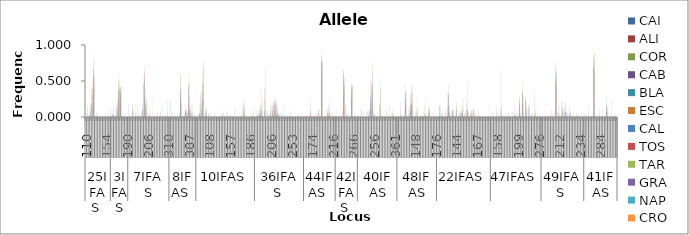
| Category | CAI | ALI | COR | CAB | BLA | ESC  | CAL | TOS | TAR | GRA | NAP  | CRO |
|---|---|---|---|---|---|---|---|---|---|---|---|---|
| 0 | 0 | 0 | 0 | 0 | 0 | 0 | 0.042 | 0 | 0 | 0 | 0 | 0 |
| 1 | 0 | 0 | 0 | 0 | 0 | 0 | 0.167 | 0 | 0 | 0.056 | 0.125 | 0 |
| 2 | 0 | 0 | 0 | 0 | 0 | 0.031 | 0 | 0 | 0 | 0 | 0.025 | 0.05 |
| 3 | 0.071 | 0.15 | 0 | 0 | 0.188 | 0.094 | 0.042 | 0.029 | 0.033 | 0 | 0 | 0 |
| 4 | 0.393 | 0.15 | 0.333 | 0.194 | 0.188 | 0.469 | 0.125 | 0.412 | 0.1 | 0.306 | 0.3 | 0.4 |
| 5 | 0.464 | 0.65 | 0.667 | 0.778 | 0.562 | 0.344 | 0.583 | 0.559 | 0.867 | 0.611 | 0.4 | 0.525 |
| 6 | 0 | 0 | 0 | 0 | 0 | 0 | 0 | 0 | 0 | 0.028 | 0.025 | 0 |
| 7 | 0.036 | 0 | 0 | 0 | 0.062 | 0 | 0 | 0 | 0 | 0 | 0.075 | 0 |
| 8 | 0 | 0 | 0 | 0 | 0 | 0 | 0.042 | 0 | 0 | 0 | 0 | 0 |
| 9 | 0 | 0 | 0 | 0.028 | 0 | 0 | 0 | 0 | 0 | 0 | 0 | 0 |
| 10 | 0 | 0 | 0 | 0 | 0 | 0.031 | 0 | 0 | 0 | 0 | 0 | 0 |
| 11 | 0.036 | 0 | 0 | 0 | 0 | 0 | 0 | 0 | 0 | 0 | 0 | 0 |
| 12 | 0 | 0 | 0 | 0 | 0 | 0.031 | 0 | 0 | 0 | 0 | 0.025 | 0 |
| 13 | 0 | 0 | 0 | 0 | 0 | 0 | 0 | 0 | 0 | 0 | 0.025 | 0 |
| 14 | 0 | 0.05 | 0 | 0 | 0 | 0 | 0 | 0 | 0 | 0 | 0 | 0 |
| 15 | 0 | 0 | 0 | 0 | 0 | 0 | 0 | 0 | 0 | 0 | 0 | 0.025 |
| 16 | 0 | 0 | 0 | 0.111 | 0.021 | 0.062 | 0 | 0 | 0 | 0 | 0 | 0 |
| 17 | 0.036 | 0.05 | 0 | 0 | 0.021 | 0.031 | 0 | 0.029 | 0.029 | 0.2 | 0.1 | 0.05 |
| 18 | 0 | 0 | 0 | 0.028 | 0.042 | 0 | 0 | 0 | 0 | 0 | 0 | 0 |
| 19 | 0 | 0 | 0 | 0 | 0 | 0 | 0.083 | 0 | 0 | 0 | 0 | 0 |
| 20 | 0.179 | 0.15 | 0 | 0.083 | 0.229 | 0.094 | 0.125 | 0.147 | 0.176 | 0.05 | 0.25 | 0.175 |
| 21 | 0.393 | 0.5 | 0.583 | 0.361 | 0.333 | 0.469 | 0.375 | 0.412 | 0.382 | 0.525 | 0.2 | 0.325 |
| 22 | 0.357 | 0.3 | 0.417 | 0.333 | 0.354 | 0.344 | 0.417 | 0.412 | 0.353 | 0.225 | 0.45 | 0.425 |
| 23 | 0 | 0 | 0 | 0.028 | 0 | 0 | 0 | 0 | 0 | 0 | 0 | 0.025 |
| 24 | 0.036 | 0 | 0 | 0 | 0 | 0 | 0 | 0 | 0 | 0 | 0 | 0 |
| 25 | 0 | 0 | 0 | 0.056 | 0 | 0 | 0 | 0 | 0 | 0 | 0 | 0 |
| 26 | 0 | 0 | 0 | 0 | 0 | 0 | 0 | 0 | 0.059 | 0 | 0 | 0 |
| 27 | 0 | 0 | 0 | 0.176 | 0 | 0 | 0 | 0 | 0 | 0 | 0 | 0 |
| 28 | 0 | 0 | 0 | 0 | 0.021 | 0 | 0 | 0 | 0 | 0 | 0 | 0 |
| 29 | 0 | 0 | 0 | 0 | 0 | 0 | 0 | 0 | 0.062 | 0.062 | 0 | 0 |
| 30 | 0.107 | 0.167 | 0.167 | 0 | 0.042 | 0 | 0.083 | 0 | 0 | 0 | 0 | 0.105 |
| 31 | 0 | 0 | 0 | 0 | 0 | 0 | 0 | 0 | 0.188 | 0.062 | 0.028 | 0 |
| 32 | 0 | 0 | 0 | 0 | 0 | 0 | 0 | 0 | 0 | 0.062 | 0 | 0 |
| 33 | 0 | 0.167 | 0 | 0 | 0 | 0 | 0 | 0 | 0.094 | 0 | 0.028 | 0.026 |
| 34 | 0 | 0 | 0 | 0 | 0 | 0 | 0.042 | 0 | 0 | 0 | 0 | 0 |
| 35 | 0 | 0 | 0 | 0 | 0 | 0 | 0.083 | 0 | 0 | 0 | 0 | 0.026 |
| 36 | 0.179 | 0.056 | 0 | 0.088 | 0 | 0.125 | 0.125 | 0.088 | 0.031 | 0 | 0.028 | 0.026 |
| 37 | 0.464 | 0.444 | 0.583 | 0.5 | 0.542 | 0.625 | 0.292 | 0.706 | 0.281 | 0.625 | 0.278 | 0.184 |
| 38 | 0.143 | 0.167 | 0 | 0.176 | 0.375 | 0.125 | 0.25 | 0.147 | 0.219 | 0 | 0.194 | 0.263 |
| 39 | 0 | 0 | 0 | 0 | 0 | 0 | 0.083 | 0 | 0 | 0 | 0 | 0 |
| 40 | 0 | 0 | 0 | 0.029 | 0 | 0.125 | 0 | 0.029 | 0 | 0 | 0.028 | 0.053 |
| 41 | 0 | 0 | 0 | 0 | 0 | 0 | 0.042 | 0 | 0 | 0 | 0 | 0 |
| 42 | 0 | 0 | 0 | 0 | 0 | 0 | 0 | 0 | 0 | 0 | 0.056 | 0.263 |
| 43 | 0 | 0 | 0 | 0 | 0 | 0 | 0 | 0 | 0 | 0 | 0.056 | 0.026 |
| 44 | 0 | 0 | 0 | 0 | 0 | 0 | 0 | 0 | 0 | 0 | 0 | 0.026 |
| 45 | 0 | 0 | 0 | 0 | 0 | 0 | 0 | 0 | 0 | 0.062 | 0.056 | 0 |
| 46 | 0 | 0 | 0 | 0 | 0 | 0 | 0 | 0 | 0 | 0.062 | 0 | 0 |
| 47 | 0 | 0 | 0 | 0 | 0 | 0 | 0 | 0 | 0.125 | 0.062 | 0.056 | 0 |
| 48 | 0 | 0 | 0 | 0 | 0 | 0 | 0 | 0 | 0 | 0 | 0.167 | 0 |
| 49 | 0 | 0 | 0 | 0 | 0 | 0 | 0 | 0 | 0 | 0 | 0.028 | 0 |
| 50 | 0 | 0 | 0 | 0 | 0 | 0 | 0 | 0.029 | 0 | 0 | 0 | 0 |
| 51 | 0.036 | 0 | 0 | 0 | 0.021 | 0 | 0 | 0 | 0 | 0 | 0 | 0 |
| 52 | 0.071 | 0 | 0.25 | 0.029 | 0 | 0 | 0 | 0 | 0 | 0 | 0 | 0 |
| 53 | 0 | 0 | 0 | 0 | 0 | 0 | 0 | 0 | 0.25 | 0.231 | 0 | 0 |
| 54 | 0 | 0 | 0 | 0 | 0 | 0 | 0 | 0 | 0 | 0.077 | 0 | 0 |
| 55 | 0.036 | 0 | 0 | 0 | 0 | 0 | 0 | 0 | 0 | 0 | 0 | 0 |
| 56 | 0 | 0 | 0 | 0.028 | 0 | 0.042 | 0 | 0 | 0 | 0 | 0 | 0 |
| 57 | 0 | 0 | 0 | 0 | 0.022 | 0 | 0 | 0 | 0 | 0 | 0 | 0 |
| 58 | 0 | 0 | 0 | 0.028 | 0 | 0 | 0 | 0 | 0 | 0 | 0 | 0 |
| 59 | 0 | 0 | 0 | 0 | 0 | 0 | 0.042 | 0 | 0.062 | 0 | 0 | 0 |
| 60 | 0.357 | 0.6 | 0.583 | 0.417 | 0.37 | 0.375 | 0.292 | 0.233 | 0.406 | 0.192 | 0.222 | 0 |
| 61 | 0 | 0 | 0 | 0.028 | 0 | 0 | 0 | 0 | 0 | 0.038 | 0 | 0 |
| 62 | 0 | 0 | 0 | 0 | 0 | 0 | 0 | 0 | 0.062 | 0 | 0 | 0 |
| 63 | 0.036 | 0.1 | 0.083 | 0.056 | 0.13 | 0.083 | 0.167 | 0 | 0.062 | 0.077 | 0.056 | 0.111 |
| 64 | 0.107 | 0 | 0.083 | 0.056 | 0 | 0 | 0.042 | 0.067 | 0 | 0.077 | 0 | 0.056 |
| 65 | 0.357 | 0.15 | 0 | 0.194 | 0.413 | 0.417 | 0.458 | 0.467 | 0.125 | 0.308 | 0.472 | 0.611 |
| 66 | 0.107 | 0.1 | 0.083 | 0.111 | 0.065 | 0.042 | 0 | 0.133 | 0.031 | 0 | 0.083 | 0.194 |
| 67 | 0 | 0.05 | 0.167 | 0.028 | 0 | 0.042 | 0 | 0.067 | 0 | 0 | 0.167 | 0.028 |
| 68 | 0 | 0 | 0 | 0 | 0 | 0 | 0 | 0.033 | 0 | 0 | 0 | 0 |
| 69 | 0 | 0 | 0 | 0.056 | 0 | 0 | 0 | 0 | 0 | 0 | 0 | 0 |
| 70 | 0.036 | 0 | 0 | 0 | 0 | 0 | 0 | 0 | 0 | 0 | 0 | 0 |
| 71 | 0 | 0 | 0 | 0 | 0 | 0 | 0.042 | 0 | 0 | 0.026 | 0.025 | 0 |
| 72 | 0.036 | 0.05 | 0.167 | 0.062 | 0.021 | 0.038 | 0 | 0 | 0 | 0 | 0.025 | 0 |
| 73 | 0.179 | 0.3 | 0.333 | 0.094 | 0.438 | 0.115 | 0.208 | 0 | 0 | 0.053 | 0.05 | 0 |
| 74 | 0.5 | 0.35 | 0.417 | 0.25 | 0.208 | 0.654 | 0.25 | 0.471 | 0.765 | 0.684 | 0.775 | 0.5 |
| 75 | 0 | 0 | 0 | 0 | 0 | 0 | 0 | 0 | 0 | 0.026 | 0.025 | 0 |
| 76 | 0.143 | 0.05 | 0 | 0.062 | 0.104 | 0 | 0.083 | 0.029 | 0.147 | 0.105 | 0 | 0.105 |
| 77 | 0 | 0 | 0 | 0 | 0 | 0 | 0 | 0 | 0 | 0.053 | 0 | 0 |
| 78 | 0 | 0.05 | 0 | 0 | 0 | 0 | 0.042 | 0 | 0 | 0 | 0 | 0.026 |
| 79 | 0 | 0 | 0 | 0 | 0 | 0 | 0.042 | 0 | 0 | 0 | 0 | 0 |
| 80 | 0 | 0 | 0 | 0 | 0 | 0 | 0 | 0 | 0 | 0 | 0.025 | 0 |
| 81 | 0 | 0 | 0 | 0 | 0 | 0 | 0 | 0 | 0 | 0.053 | 0 | 0 |
| 82 | 0 | 0 | 0 | 0 | 0 | 0 | 0 | 0.029 | 0 | 0 | 0 | 0 |
| 83 | 0 | 0 | 0 | 0 | 0 | 0 | 0 | 0 | 0 | 0 | 0.025 | 0 |
| 84 | 0 | 0 | 0 | 0 | 0 | 0 | 0 | 0 | 0 | 0 | 0 | 0.026 |
| 85 | 0 | 0 | 0 | 0 | 0.042 | 0 | 0 | 0 | 0 | 0 | 0 | 0 |
| 86 | 0 | 0.05 | 0 | 0 | 0 | 0 | 0 | 0.059 | 0 | 0 | 0 | 0 |
| 87 | 0 | 0 | 0.083 | 0.031 | 0 | 0 | 0 | 0 | 0 | 0 | 0 | 0 |
| 88 | 0 | 0 | 0 | 0 | 0 | 0 | 0 | 0 | 0 | 0 | 0.025 | 0 |
| 89 | 0 | 0 | 0 | 0 | 0.021 | 0.077 | 0 | 0.029 | 0 | 0 | 0 | 0.079 |
| 90 | 0 | 0 | 0 | 0 | 0.021 | 0 | 0 | 0 | 0 | 0 | 0 | 0 |
| 91 | 0 | 0 | 0 | 0 | 0.021 | 0 | 0.042 | 0 | 0 | 0 | 0 | 0 |
| 92 | 0 | 0 | 0 | 0 | 0 | 0 | 0 | 0.029 | 0 | 0 | 0 | 0 |
| 93 | 0 | 0 | 0 | 0 | 0.021 | 0 | 0 | 0 | 0 | 0 | 0 | 0.026 |
| 94 | 0 | 0 | 0 | 0.125 | 0 | 0 | 0 | 0 | 0 | 0 | 0 | 0 |
| 95 | 0 | 0 | 0 | 0 | 0.021 | 0 | 0 | 0 | 0 | 0 | 0 | 0 |
| 96 | 0 | 0 | 0 | 0 | 0 | 0 | 0 | 0.029 | 0 | 0 | 0 | 0 |
| 97 | 0 | 0 | 0 | 0 | 0 | 0 | 0 | 0 | 0 | 0 | 0 | 0.053 |
| 98 | 0 | 0 | 0 | 0 | 0 | 0 | 0 | 0.029 | 0 | 0 | 0 | 0 |
| 99 | 0 | 0 | 0 | 0.125 | 0 | 0 | 0.042 | 0 | 0 | 0 | 0 | 0 |
| 100 | 0.036 | 0.15 | 0 | 0.25 | 0.083 | 0.115 | 0.125 | 0.206 | 0.029 | 0 | 0.025 | 0.105 |
| 101 | 0 | 0 | 0 | 0 | 0 | 0 | 0 | 0 | 0 | 0 | 0 | 0.026 |
| 102 | 0.036 | 0 | 0 | 0 | 0 | 0 | 0 | 0 | 0 | 0 | 0 | 0 |
| 103 | 0 | 0 | 0 | 0 | 0 | 0 | 0 | 0 | 0.029 | 0 | 0 | 0 |
| 104 | 0 | 0 | 0 | 0 | 0 | 0 | 0 | 0.029 | 0.029 | 0 | 0 | 0.053 |
| 105 | 0.036 | 0 | 0 | 0 | 0 | 0 | 0 | 0 | 0 | 0 | 0 | 0 |
| 106 | 0 | 0 | 0 | 0 | 0 | 0 | 0.125 | 0.059 | 0 | 0 | 0 | 0 |
| 107 | 0 | 0 | 0 | 0 | 0 | 0 | 0 | 0 | 0.029 | 0 | 0 | 0 |
| 108 | 0 | 0 | 0 | 0 | 0 | 0 | 0 | 0.094 | 0 | 0 | 0.025 | 0.079 |
| 109 | 0.036 | 0 | 0 | 0 | 0.021 | 0.033 | 0 | 0.031 | 0 | 0 | 0.025 | 0.079 |
| 110 | 0.036 | 0.15 | 0 | 0.056 | 0.042 | 0.067 | 0.042 | 0 | 0.029 | 0.025 | 0.175 | 0.132 |
| 111 | 0.107 | 0.4 | 0 | 0 | 0.083 | 0 | 0.042 | 0.094 | 0.088 | 0.2 | 0.2 | 0.132 |
| 112 | 0 | 0 | 0.083 | 0 | 0.021 | 0 | 0 | 0 | 0 | 0 | 0 | 0.026 |
| 113 | 0.107 | 0 | 0 | 0.389 | 0.062 | 0.233 | 0.083 | 0.031 | 0.412 | 0.675 | 0.2 | 0 |
| 114 | 0 | 0 | 0 | 0 | 0.021 | 0 | 0.083 | 0 | 0 | 0 | 0.05 | 0.053 |
| 115 | 0 | 0.1 | 0 | 0 | 0.021 | 0 | 0 | 0 | 0 | 0 | 0.05 | 0 |
| 116 | 0 | 0 | 0 | 0 | 0 | 0.033 | 0 | 0.031 | 0.029 | 0.05 | 0 | 0 |
| 117 | 0.036 | 0.2 | 0 | 0.083 | 0.104 | 0.033 | 0 | 0.156 | 0 | 0 | 0 | 0.026 |
| 118 | 0 | 0 | 0.083 | 0 | 0.083 | 0.1 | 0.167 | 0.219 | 0 | 0 | 0.025 | 0.026 |
| 119 | 0.179 | 0.05 | 0.167 | 0.111 | 0.188 | 0.233 | 0.292 | 0.219 | 0.059 | 0 | 0.025 | 0.132 |
| 120 | 0.214 | 0 | 0.25 | 0.194 | 0.167 | 0.2 | 0.042 | 0.062 | 0.088 | 0.025 | 0 | 0.105 |
| 121 | 0.179 | 0.05 | 0.25 | 0.139 | 0.062 | 0 | 0.042 | 0.031 | 0.176 | 0.025 | 0.05 | 0.026 |
| 122 | 0.036 | 0 | 0 | 0.028 | 0.062 | 0 | 0.042 | 0 | 0 | 0 | 0.05 | 0.026 |
| 123 | 0 | 0 | 0 | 0 | 0.062 | 0 | 0 | 0 | 0 | 0 | 0.025 | 0.053 |
| 124 | 0 | 0 | 0 | 0 | 0 | 0 | 0.042 | 0 | 0 | 0 | 0 | 0 |
| 125 | 0 | 0 | 0.167 | 0 | 0 | 0 | 0 | 0 | 0 | 0 | 0.05 | 0.026 |
| 126 | 0.036 | 0 | 0 | 0 | 0 | 0 | 0 | 0 | 0 | 0 | 0 | 0 |
| 127 | 0 | 0 | 0 | 0 | 0 | 0 | 0.042 | 0 | 0.029 | 0 | 0 | 0 |
| 128 | 0 | 0 | 0 | 0 | 0 | 0 | 0 | 0 | 0.059 | 0 | 0 | 0 |
| 129 | 0 | 0 | 0 | 0 | 0 | 0 | 0.083 | 0 | 0 | 0 | 0.025 | 0 |
| 130 | 0.036 | 0 | 0 | 0 | 0 | 0 | 0 | 0 | 0 | 0 | 0 | 0 |
| 131 | 0 | 0 | 0 | 0 | 0 | 0 | 0 | 0 | 0 | 0 | 0 | 0.026 |
| 132 | 0 | 0 | 0 | 0 | 0 | 0 | 0 | 0 | 0 | 0 | 0 | 0.026 |
| 133 | 0 | 0 | 0 | 0 | 0 | 0 | 0 | 0 | 0 | 0 | 0 | 0.026 |
| 134 | 0 | 0 | 0 | 0 | 0 | 0.033 | 0 | 0 | 0 | 0 | 0.025 | 0 |
| 135 | 0 | 0 | 0 | 0 | 0 | 0 | 0 | 0.031 | 0 | 0 | 0 | 0 |
| 136 | 0 | 0 | 0 | 0 | 0 | 0.033 | 0 | 0 | 0 | 0 | 0 | 0 |
| 137 | 0 | 0.05 | 0 | 0 | 0 | 0 | 0 | 0 | 0 | 0 | 0 | 0 |
| 138 | 0 | 0 | 0 | 0 | 0 | 0 | 0 | 0.029 | 0 | 0 | 0 | 0 |
| 139 | 0 | 0 | 0 | 0 | 0 | 0 | 0 | 0 | 0 | 0 | 0 | 0.026 |
| 140 | 0 | 0 | 0 | 0 | 0 | 0 | 0 | 0 | 0 | 0 | 0.025 | 0 |
| 141 | 0 | 0 | 0 | 0 | 0 | 0 | 0 | 0 | 0 | 0 | 0.025 | 0 |
| 142 | 0.071 | 0.05 | 0.25 | 0.111 | 0 | 0.031 | 0 | 0 | 0 | 0 | 0.075 | 0 |
| 143 | 0 | 0 | 0 | 0 | 0 | 0 | 0 | 0 | 0.029 | 0 | 0 | 0 |
| 144 | 0 | 0 | 0 | 0 | 0 | 0 | 0 | 0.029 | 0 | 0 | 0 | 0 |
| 145 | 0 | 0 | 0 | 0 | 0 | 0 | 0 | 0.059 | 0 | 0 | 0 | 0 |
| 146 | 0 | 0 | 0 | 0 | 0 | 0 | 0 | 0 | 0 | 0.059 | 0.075 | 0.026 |
| 147 | 0 | 0.05 | 0 | 0 | 0 | 0 | 0 | 0 | 0.088 | 0.118 | 0 | 0 |
| 148 | 0 | 0.1 | 0 | 0 | 0 | 0 | 0 | 0 | 0.029 | 0 | 0 | 0 |
| 149 | 0.786 | 0.65 | 0.5 | 0.722 | 0.917 | 0.812 | 0.75 | 0.853 | 0.735 | 0.765 | 0.775 | 0.789 |
| 150 | 0 | 0 | 0 | 0 | 0 | 0 | 0 | 0 | 0 | 0 | 0 | 0.026 |
| 151 | 0 | 0 | 0 | 0 | 0 | 0 | 0 | 0 | 0 | 0 | 0 | 0.026 |
| 152 | 0 | 0 | 0 | 0 | 0 | 0 | 0 | 0 | 0 | 0 | 0 | 0.026 |
| 153 | 0.107 | 0.05 | 0 | 0.083 | 0.042 | 0 | 0.167 | 0.029 | 0.029 | 0 | 0.025 | 0.079 |
| 154 | 0.036 | 0.05 | 0.25 | 0.056 | 0.042 | 0.156 | 0.083 | 0 | 0 | 0 | 0 | 0 |
| 155 | 0 | 0 | 0 | 0 | 0 | 0 | 0 | 0 | 0 | 0.059 | 0 | 0 |
| 156 | 0 | 0.05 | 0 | 0 | 0 | 0 | 0 | 0 | 0.088 | 0 | 0 | 0 |
| 157 | 0 | 0 | 0 | 0.028 | 0 | 0 | 0 | 0 | 0 | 0 | 0 | 0 |
| 158 | 0.036 | 0 | 0 | 0 | 0 | 0 | 0.091 | 0 | 0 | 0 | 0 | 0 |
| 159 | 0 | 0 | 0 | 0 | 0 | 0 | 0 | 0.029 | 0 | 0 | 0 | 0.028 |
| 160 | 0 | 0 | 0 | 0 | 0 | 0 | 0 | 0 | 0 | 0 | 0 | 0.028 |
| 161 | 0 | 0 | 0 | 0 | 0 | 0 | 0 | 0.059 | 0 | 0 | 0 | 0 |
| 162 | 0 | 0 | 0 | 0 | 0.021 | 0 | 0 | 0 | 0.062 | 0.118 | 0 | 0 |
| 163 | 0.5 | 0.6 | 0.667 | 0.324 | 0.646 | 0.4 | 0.591 | 0.529 | 0.469 | 0.441 | 0.55 | 0.389 |
| 164 | 0 | 0 | 0 | 0.176 | 0 | 0.133 | 0.045 | 0 | 0.031 | 0 | 0 | 0.028 |
| 165 | 0 | 0 | 0 | 0 | 0.042 | 0 | 0 | 0 | 0 | 0 | 0 | 0.056 |
| 166 | 0 | 0 | 0 | 0.059 | 0 | 0 | 0 | 0 | 0 | 0 | 0 | 0 |
| 167 | 0 | 0 | 0 | 0 | 0.021 | 0 | 0 | 0 | 0 | 0 | 0 | 0 |
| 168 | 0.464 | 0.4 | 0.333 | 0.441 | 0.229 | 0.433 | 0.273 | 0.382 | 0.438 | 0.441 | 0.45 | 0.417 |
| 169 | 0 | 0 | 0 | 0 | 0.021 | 0 | 0 | 0 | 0 | 0 | 0 | 0 |
| 170 | 0 | 0 | 0 | 0 | 0.021 | 0.033 | 0 | 0 | 0 | 0 | 0 | 0 |
| 171 | 0 | 0 | 0 | 0 | 0 | 0 | 0 | 0 | 0 | 0 | 0 | 0.056 |
| 172 | 0 | 0 | 0 | 0 | 0 | 0 | 0.042 | 0 | 0 | 0 | 0 | 0 |
| 173 | 0 | 0 | 0 | 0 | 0 | 0 | 0 | 0 | 0 | 0 | 0.143 | 0 |
| 174 | 0 | 0 | 0 | 0 | 0 | 0 | 0.083 | 0 | 0 | 0.091 | 0 | 0 |
| 175 | 0 | 0 | 0 | 0 | 0 | 0 | 0 | 0 | 0 | 0.091 | 0 | 0 |
| 176 | 0 | 0 | 0 | 0 | 0 | 0 | 0.042 | 0 | 0 | 0 | 0 | 0 |
| 177 | 0 | 0 | 0 | 0 | 0 | 0 | 0 | 0 | 0 | 0.091 | 0.071 | 0 |
| 178 | 0 | 0 | 0 | 0 | 0 | 0 | 0 | 0 | 0.071 | 0.091 | 0.071 | 0 |
| 179 | 0.036 | 0 | 0 | 0 | 0 | 0 | 0.125 | 0 | 0 | 0.091 | 0.071 | 0.033 |
| 180 | 0.321 | 0.2 | 0.5 | 0.286 | 0.104 | 0.107 | 0.25 | 0 | 0.321 | 0.227 | 0.179 | 0.067 |
| 181 | 0.464 | 0.45 | 0.5 | 0.643 | 0.417 | 0.75 | 0.208 | 0.469 | 0.071 | 0.136 | 0.393 | 0.367 |
| 182 | 0 | 0 | 0 | 0 | 0.062 | 0 | 0 | 0.031 | 0.179 | 0.045 | 0.036 | 0.033 |
| 183 | 0 | 0 | 0 | 0.036 | 0 | 0 | 0 | 0 | 0 | 0 | 0 | 0 |
| 184 | 0 | 0 | 0 | 0 | 0 | 0 | 0 | 0 | 0 | 0 | 0 | 0.067 |
| 185 | 0 | 0 | 0 | 0 | 0 | 0 | 0 | 0 | 0.036 | 0 | 0 | 0 |
| 186 | 0.179 | 0.15 | 0 | 0 | 0.375 | 0.107 | 0.042 | 0.469 | 0.25 | 0.045 | 0 | 0.4 |
| 187 | 0 | 0 | 0 | 0 | 0 | 0 | 0 | 0 | 0.036 | 0 | 0 | 0 |
| 188 | 0 | 0 | 0 | 0 | 0 | 0 | 0 | 0 | 0 | 0 | 0 | 0.033 |
| 189 | 0 | 0 | 0 | 0 | 0 | 0 | 0 | 0 | 0 | 0.045 | 0 | 0 |
| 190 | 0 | 0.1 | 0 | 0 | 0 | 0 | 0 | 0 | 0 | 0 | 0 | 0 |
| 191 | 0 | 0 | 0 | 0 | 0 | 0.036 | 0 | 0 | 0 | 0 | 0 | 0 |
| 192 | 0 | 0 | 0 | 0 | 0 | 0 | 0.167 | 0 | 0 | 0 | 0 | 0 |
| 193 | 0 | 0 | 0 | 0 | 0 | 0 | 0 | 0.031 | 0 | 0.045 | 0 | 0 |
| 194 | 0 | 0.1 | 0 | 0.036 | 0 | 0 | 0.042 | 0 | 0.036 | 0 | 0.036 | 0 |
| 195 | 0 | 0 | 0 | 0 | 0.021 | 0 | 0 | 0 | 0 | 0 | 0 | 0 |
| 196 | 0 | 0 | 0 | 0 | 0.021 | 0 | 0 | 0 | 0 | 0 | 0 | 0 |
| 197 | 0 | 0 | 0 | 0 | 0 | 0 | 0 | 0 | 0 | 0 | 0 | 0.025 |
| 198 | 0 | 0 | 0 | 0 | 0 | 0 | 0 | 0 | 0 | 0 | 0 | 0.025 |
| 199 | 0 | 0.111 | 0 | 0 | 0.021 | 0 | 0.208 | 0.029 | 0 | 0 | 0 | 0 |
| 200 | 0 | 0 | 0 | 0 | 0 | 0 | 0.042 | 0 | 0 | 0 | 0 | 0 |
| 201 | 0 | 0 | 0 | 0 | 0.021 | 0 | 0.042 | 0 | 0 | 0 | 0 | 0 |
| 202 | 0.464 | 0.167 | 0.25 | 0.333 | 0.375 | 0.219 | 0.125 | 0.324 | 0.219 | 0.325 | 0.263 | 0.175 |
| 203 | 0 | 0 | 0 | 0 | 0 | 0 | 0 | 0 | 0 | 0 | 0 | 0.025 |
| 204 | 0 | 0 | 0 | 0 | 0 | 0.031 | 0.125 | 0 | 0 | 0 | 0 | 0 |
| 205 | 0.143 | 0.056 | 0.083 | 0.167 | 0.188 | 0.312 | 0.083 | 0.118 | 0.312 | 0.175 | 0.132 | 0.35 |
| 206 | 0.179 | 0.444 | 0.167 | 0.222 | 0.312 | 0.188 | 0.125 | 0.176 | 0.094 | 0.325 | 0.447 | 0.35 |
| 207 | 0 | 0 | 0 | 0 | 0 | 0 | 0 | 0 | 0.031 | 0.025 | 0 | 0 |
| 208 | 0 | 0 | 0 | 0 | 0 | 0.094 | 0.042 | 0 | 0 | 0 | 0 | 0 |
| 209 | 0 | 0.056 | 0 | 0.111 | 0 | 0 | 0 | 0 | 0.281 | 0.125 | 0.053 | 0.025 |
| 210 | 0 | 0 | 0 | 0 | 0 | 0.031 | 0 | 0 | 0 | 0 | 0 | 0 |
| 211 | 0 | 0 | 0 | 0 | 0 | 0 | 0 | 0 | 0 | 0.025 | 0 | 0 |
| 212 | 0 | 0 | 0 | 0.028 | 0.021 | 0 | 0 | 0 | 0.031 | 0 | 0 | 0 |
| 213 | 0 | 0 | 0 | 0 | 0 | 0 | 0 | 0.088 | 0 | 0 | 0 | 0 |
| 214 | 0 | 0 | 0.167 | 0.028 | 0.021 | 0 | 0 | 0.059 | 0.031 | 0 | 0 | 0 |
| 215 | 0.036 | 0 | 0.25 | 0 | 0 | 0 | 0.042 | 0 | 0 | 0 | 0 | 0 |
| 216 | 0.036 | 0 | 0 | 0 | 0 | 0 | 0 | 0.059 | 0 | 0 | 0 | 0 |
| 217 | 0.143 | 0.111 | 0.083 | 0.111 | 0.042 | 0.062 | 0.083 | 0.147 | 0 | 0 | 0.053 | 0.025 |
| 218 | 0 | 0 | 0 | 0 | 0 | 0 | 0 | 0 | 0 | 0 | 0.053 | 0 |
| 219 | 0 | 0.056 | 0 | 0 | 0 | 0 | 0 | 0 | 0 | 0 | 0 | 0 |
| 220 | 0 | 0 | 0 | 0 | 0 | 0 | 0.083 | 0 | 0 | 0 | 0 | 0 |
| 221 | 0 | 0 | 0 | 0 | 0 | 0.062 | 0 | 0 | 0 | 0 | 0 | 0 |
| 222 | 0 | 0 | 0 | 0 | 0 | 0 | 0 | 0 | 0 | 0 | 0.029 | 0 |
| 223 | 0 | 0 | 0 | 0 | 0 | 0 | 0.042 | 0 | 0 | 0 | 0.147 | 0 |
| 224 | 0.143 | 0.167 | 0 | 0.139 | 0 | 0 | 0.042 | 0 | 0 | 0 | 0 | 0.05 |
| 225 | 0 | 0 | 0 | 0 | 0 | 0.062 | 0 | 0 | 0.029 | 0 | 0.088 | 0.025 |
| 226 | 0.036 | 0 | 0 | 0 | 0 | 0 | 0 | 0 | 0 | 0 | 0 | 0 |
| 227 | 0 | 0 | 0 | 0 | 0 | 0 | 0.083 | 0 | 0 | 0 | 0.029 | 0.1 |
| 228 | 0 | 0.056 | 0 | 0 | 0 | 0 | 0 | 0 | 0 | 0 | 0 | 0 |
| 229 | 0.143 | 0.333 | 0.083 | 0.333 | 0.271 | 0.156 | 0.292 | 0.324 | 0.324 | 0.45 | 0.147 | 0.175 |
| 230 | 0.107 | 0.056 | 0 | 0 | 0.062 | 0.156 | 0.042 | 0 | 0 | 0 | 0 | 0 |
| 231 | 0 | 0 | 0 | 0 | 0 | 0.031 | 0 | 0.088 | 0 | 0 | 0.088 | 0 |
| 232 | 0.107 | 0.111 | 0.083 | 0 | 0.104 | 0.094 | 0.042 | 0 | 0.118 | 0 | 0 | 0.05 |
| 233 | 0 | 0 | 0 | 0.028 | 0 | 0 | 0 | 0 | 0 | 0 | 0 | 0 |
| 234 | 0 | 0 | 0.083 | 0.028 | 0.104 | 0.188 | 0.042 | 0.147 | 0 | 0 | 0.088 | 0.2 |
| 235 | 0 | 0 | 0 | 0 | 0 | 0 | 0 | 0 | 0.059 | 0 | 0.029 | 0.025 |
| 236 | 0 | 0 | 0.083 | 0.028 | 0 | 0 | 0 | 0 | 0 | 0 | 0 | 0 |
| 237 | 0 | 0.056 | 0.083 | 0 | 0.062 | 0.062 | 0.042 | 0.088 | 0.059 | 0 | 0.029 | 0.025 |
| 238 | 0.071 | 0.056 | 0.167 | 0.056 | 0.146 | 0.125 | 0.083 | 0.029 | 0.059 | 0.025 | 0.265 | 0 |
| 239 | 0 | 0 | 0 | 0 | 0 | 0.031 | 0 | 0.029 | 0 | 0.05 | 0 | 0 |
| 240 | 0 | 0 | 0.083 | 0 | 0 | 0 | 0 | 0 | 0 | 0 | 0 | 0 |
| 241 | 0.214 | 0.111 | 0.083 | 0.111 | 0.104 | 0.031 | 0.083 | 0.088 | 0.059 | 0.475 | 0.029 | 0 |
| 242 | 0 | 0 | 0.083 | 0.056 | 0 | 0 | 0 | 0 | 0 | 0 | 0 | 0 |
| 243 | 0 | 0 | 0 | 0 | 0.042 | 0 | 0.042 | 0.059 | 0 | 0 | 0 | 0.025 |
| 244 | 0.107 | 0.056 | 0 | 0.083 | 0 | 0.031 | 0 | 0 | 0.088 | 0 | 0 | 0.075 |
| 245 | 0 | 0 | 0 | 0.111 | 0.104 | 0.031 | 0.083 | 0.118 | 0 | 0 | 0.029 | 0.075 |
| 246 | 0 | 0 | 0 | 0.028 | 0 | 0 | 0 | 0.029 | 0.029 | 0 | 0 | 0.1 |
| 247 | 0 | 0 | 0 | 0 | 0 | 0 | 0 | 0 | 0.088 | 0 | 0 | 0 |
| 248 | 0 | 0 | 0 | 0 | 0 | 0 | 0.083 | 0 | 0 | 0 | 0 | 0 |
| 249 | 0.036 | 0 | 0 | 0 | 0 | 0 | 0 | 0 | 0 | 0 | 0 | 0 |
| 250 | 0 | 0 | 0 | 0 | 0 | 0 | 0 | 0 | 0.059 | 0 | 0 | 0 |
| 251 | 0.036 | 0 | 0 | 0 | 0 | 0 | 0 | 0 | 0 | 0 | 0 | 0 |
| 252 | 0 | 0 | 0 | 0 | 0 | 0 | 0 | 0 | 0 | 0 | 0 | 0.025 |
| 253 | 0 | 0 | 0 | 0 | 0 | 0 | 0 | 0 | 0 | 0 | 0 | 0.05 |
| 254 | 0 | 0 | 0 | 0 | 0 | 0 | 0 | 0 | 0.029 | 0 | 0 | 0 |
| 255 | 0 | 0 | 0.167 | 0 | 0 | 0 | 0 | 0 | 0 | 0 | 0 | 0 |
| 256 | 0 | 0 | 0 | 0 | 0 | 0 | 0 | 0 | 0.067 | 0 | 0 | 0 |
| 257 | 0 | 0 | 0 | 0 | 0 | 0 | 0 | 0 | 0.067 | 0 | 0 | 0 |
| 258 | 0.071 | 0 | 0 | 0 | 0 | 0 | 0 | 0 | 0 | 0 | 0 | 0 |
| 259 | 0 | 0 | 0 | 0 | 0 | 0 | 0 | 0 | 0 | 0.133 | 0.062 | 0.025 |
| 260 | 0 | 0 | 0 | 0 | 0 | 0 | 0.083 | 0 | 0.033 | 0 | 0 | 0 |
| 261 | 0 | 0 | 0 | 0 | 0 | 0 | 0.083 | 0 | 0 | 0 | 0 | 0 |
| 262 | 0 | 0.1 | 0 | 0 | 0 | 0 | 0.042 | 0 | 0.033 | 0.667 | 0.156 | 0.075 |
| 263 | 0 | 0 | 0.167 | 0 | 0 | 0 | 0 | 0 | 0.033 | 0 | 0 | 0 |
| 264 | 0 | 0 | 0 | 0 | 0 | 0 | 0.042 | 0 | 0 | 0 | 0 | 0 |
| 265 | 0 | 0 | 0 | 0.033 | 0 | 0 | 0 | 0 | 0 | 0 | 0 | 0 |
| 266 | 0 | 0 | 0 | 0 | 0 | 0 | 0 | 0 | 0 | 0 | 0.062 | 0 |
| 267 | 0 | 0 | 0 | 0.067 | 0 | 0 | 0 | 0 | 0 | 0 | 0 | 0 |
| 268 | 0 | 0 | 0 | 0 | 0 | 0 | 0 | 0 | 0 | 0 | 0 | 0.025 |
| 269 | 0 | 0 | 0 | 0 | 0 | 0 | 0 | 0 | 0.067 | 0.067 | 0 | 0 |
| 270 | 0 | 0 | 0 | 0 | 0 | 0 | 0 | 0 | 0 | 0 | 0 | 0.025 |
| 271 | 0 | 0 | 0 | 0.033 | 0.042 | 0.038 | 0.167 | 0 | 0.167 | 0 | 0 | 0.025 |
| 272 | 0 | 0 | 0 | 0 | 0 | 0.038 | 0 | 0.029 | 0 | 0 | 0.062 | 0.075 |
| 273 | 0 | 0 | 0 | 0 | 0 | 0 | 0 | 0 | 0 | 0 | 0 | 0.025 |
| 274 | 0.179 | 0.15 | 0.083 | 0.2 | 0.042 | 0.269 | 0.292 | 0.235 | 0.133 | 0 | 0.031 | 0.125 |
| 275 | 0 | 0 | 0 | 0.067 | 0 | 0 | 0 | 0 | 0 | 0 | 0 | 0 |
| 276 | 0.321 | 0.25 | 0.5 | 0.3 | 0.375 | 0.346 | 0.167 | 0.324 | 0.1 | 0.067 | 0.188 | 0.25 |
| 277 | 0 | 0 | 0 | 0 | 0 | 0 | 0 | 0 | 0 | 0 | 0 | 0.025 |
| 278 | 0.25 | 0 | 0.25 | 0.267 | 0.229 | 0.192 | 0.125 | 0.118 | 0.233 | 0.067 | 0.156 | 0.15 |
| 279 | 0 | 0 | 0 | 0 | 0 | 0 | 0 | 0 | 0 | 0 | 0.031 | 0 |
| 280 | 0.107 | 0.15 | 0 | 0 | 0.167 | 0 | 0 | 0.206 | 0 | 0 | 0.156 | 0.025 |
| 281 | 0 | 0 | 0 | 0 | 0.042 | 0 | 0 | 0 | 0 | 0 | 0.031 | 0 |
| 282 | 0.036 | 0 | 0 | 0 | 0.042 | 0 | 0 | 0 | 0.067 | 0 | 0.031 | 0.05 |
| 283 | 0 | 0 | 0 | 0 | 0 | 0 | 0 | 0 | 0 | 0 | 0.031 | 0.05 |
| 284 | 0.036 | 0.35 | 0 | 0.033 | 0.062 | 0.115 | 0 | 0.029 | 0 | 0 | 0 | 0 |
| 285 | 0 | 0 | 0 | 0 | 0 | 0 | 0 | 0.029 | 0 | 0 | 0 | 0 |
| 286 | 0 | 0 | 0 | 0 | 0 | 0 | 0 | 0 | 0 | 0 | 0 | 0.05 |
| 287 | 0 | 0 | 0 | 0 | 0 | 0 | 0 | 0.029 | 0 | 0 | 0 | 0 |
| 288 | 0 | 0 | 0 | 0 | 0 | 0 | 0 | 0 | 0.029 | 0 | 0 | 0 |
| 289 | 0 | 0 | 0 | 0 | 0 | 0 | 0 | 0 | 0.029 | 0 | 0 | 0 |
| 290 | 0 | 0 | 0 | 0 | 0 | 0 | 0 | 0 | 0.029 | 0 | 0 | 0 |
| 291 | 0 | 0.05 | 0 | 0 | 0 | 0 | 0 | 0 | 0 | 0 | 0 | 0 |
| 292 | 0 | 0 | 0 | 0 | 0 | 0.031 | 0 | 0 | 0 | 0 | 0 | 0 |
| 293 | 0 | 0 | 0 | 0 | 0 | 0 | 0.042 | 0 | 0 | 0.025 | 0.028 | 0 |
| 294 | 0 | 0 | 0 | 0 | 0 | 0 | 0 | 0 | 0 | 0.1 | 0 | 0 |
| 295 | 0 | 0 | 0 | 0 | 0 | 0.031 | 0.042 | 0 | 0 | 0 | 0 | 0 |
| 296 | 0 | 0 | 0 | 0 | 0 | 0 | 0 | 0 | 0 | 0.1 | 0 | 0 |
| 297 | 0.5 | 0.55 | 0.5 | 0.656 | 0.75 | 0.438 | 0.625 | 0.618 | 0.647 | 0.425 | 0.667 | 0.5 |
| 298 | 0 | 0.05 | 0 | 0 | 0 | 0 | 0 | 0 | 0.059 | 0.025 | 0.139 | 0.375 |
| 299 | 0.036 | 0 | 0 | 0.062 | 0 | 0.156 | 0 | 0 | 0 | 0 | 0.056 | 0 |
| 300 | 0 | 0 | 0 | 0 | 0.021 | 0 | 0 | 0 | 0 | 0 | 0.028 | 0 |
| 301 | 0.214 | 0.05 | 0.25 | 0.062 | 0.062 | 0.125 | 0.125 | 0 | 0.118 | 0.1 | 0 | 0.05 |
| 302 | 0 | 0.1 | 0 | 0 | 0 | 0 | 0 | 0 | 0.088 | 0.15 | 0 | 0.025 |
| 303 | 0.071 | 0.2 | 0.083 | 0.062 | 0.062 | 0.156 | 0 | 0.059 | 0 | 0 | 0 | 0 |
| 304 | 0.071 | 0 | 0 | 0.094 | 0.021 | 0 | 0 | 0.059 | 0 | 0 | 0.056 | 0 |
| 305 | 0 | 0 | 0 | 0 | 0.042 | 0 | 0 | 0 | 0 | 0 | 0 | 0 |
| 306 | 0.107 | 0 | 0.167 | 0.031 | 0 | 0.062 | 0.083 | 0.029 | 0 | 0.05 | 0.028 | 0 |
| 307 | 0 | 0 | 0 | 0 | 0 | 0 | 0 | 0.059 | 0 | 0 | 0 | 0.025 |
| 308 | 0 | 0 | 0 | 0 | 0 | 0 | 0 | 0.029 | 0 | 0 | 0 | 0 |
| 309 | 0 | 0 | 0 | 0 | 0.021 | 0 | 0 | 0 | 0 | 0 | 0 | 0 |
| 310 | 0 | 0 | 0 | 0.031 | 0.021 | 0 | 0 | 0.059 | 0 | 0.025 | 0 | 0.025 |
| 311 | 0 | 0 | 0 | 0 | 0 | 0 | 0.042 | 0 | 0 | 0 | 0 | 0 |
| 312 | 0 | 0 | 0 | 0 | 0 | 0 | 0.042 | 0 | 0 | 0 | 0 | 0 |
| 313 | 0 | 0 | 0 | 0 | 0 | 0 | 0 | 0.059 | 0 | 0 | 0 | 0 |
| 314 | 0 | 0 | 0 | 0 | 0 | 0 | 0 | 0.029 | 0 | 0 | 0 | 0 |
| 315 | 0 | 0.05 | 0 | 0.028 | 0 | 0 | 0 | 0 | 0 | 0 | 0 | 0 |
| 316 | 0 | 0 | 0 | 0 | 0 | 0 | 0 | 0.029 | 0.029 | 0 | 0 | 0 |
| 317 | 0 | 0 | 0 | 0 | 0 | 0 | 0 | 0 | 0.029 | 0.167 | 0.053 | 0 |
| 318 | 0 | 0 | 0 | 0 | 0 | 0 | 0 | 0 | 0 | 0.028 | 0 | 0 |
| 319 | 0 | 0 | 0 | 0 | 0 | 0 | 0 | 0 | 0 | 0.028 | 0 | 0 |
| 320 | 0 | 0 | 0 | 0 | 0 | 0.033 | 0 | 0 | 0 | 0 | 0 | 0 |
| 321 | 0.857 | 0.75 | 0.667 | 0.667 | 0.688 | 0.833 | 0.792 | 0.882 | 0.676 | 0.611 | 0.605 | 0.925 |
| 322 | 0 | 0 | 0 | 0 | 0 | 0.033 | 0 | 0 | 0 | 0 | 0 | 0 |
| 323 | 0 | 0 | 0 | 0 | 0 | 0 | 0 | 0 | 0 | 0 | 0 | 0.05 |
| 324 | 0 | 0 | 0 | 0 | 0 | 0 | 0.042 | 0 | 0.059 | 0 | 0.132 | 0 |
| 325 | 0 | 0 | 0 | 0.028 | 0 | 0 | 0 | 0 | 0 | 0 | 0 | 0 |
| 326 | 0 | 0 | 0 | 0 | 0 | 0 | 0 | 0 | 0.029 | 0.028 | 0.132 | 0 |
| 327 | 0 | 0 | 0 | 0 | 0 | 0 | 0 | 0 | 0 | 0 | 0.026 | 0 |
| 328 | 0 | 0 | 0 | 0 | 0 | 0 | 0 | 0 | 0.029 | 0 | 0 | 0.025 |
| 329 | 0.071 | 0.15 | 0.083 | 0.167 | 0.292 | 0.1 | 0.167 | 0.029 | 0.147 | 0.139 | 0.026 | 0 |
| 330 | 0.071 | 0 | 0 | 0.111 | 0 | 0 | 0 | 0 | 0 | 0 | 0 | 0 |
| 331 | 0 | 0 | 0 | 0 | 0 | 0 | 0 | 0 | 0 | 0 | 0.026 | 0 |
| 332 | 0 | 0 | 0.25 | 0 | 0.021 | 0 | 0 | 0 | 0 | 0 | 0 | 0 |
| 333 | 0 | 0 | 0 | 0 | 0 | 0 | 0 | 0.029 | 0 | 0 | 0 | 0 |
| 334 | 0 | 0 | 0 | 0 | 0 | 0 | 0 | 0.029 | 0 | 0 | 0 | 0 |
| 335 | 0 | 0.05 | 0 | 0 | 0 | 0 | 0 | 0 | 0 | 0 | 0 | 0 |